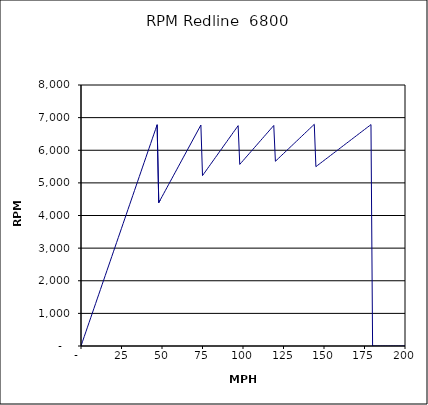
| Category | RPM Redline  6800 |
|---|---|
| 0.0 | 0 |
| 1.0 | 144.311 |
| 2.0 | 288.622 |
| 3.0 | 432.933 |
| 4.0 | 577.244 |
| 5.0 | 721.555 |
| 6.0 | 865.865 |
| 7.0 | 1010.176 |
| 8.0 | 1154.487 |
| 9.0 | 1298.798 |
| 10.0 | 1443.109 |
| 11.0 | 1587.42 |
| 12.0 | 1731.731 |
| 13.0 | 1876.042 |
| 14.0 | 2020.353 |
| 15.0 | 2164.664 |
| 16.0 | 2308.974 |
| 17.0 | 2453.285 |
| 18.0 | 2597.596 |
| 19.0 | 2741.907 |
| 20.0 | 2886.218 |
| 21.0 | 3030.529 |
| 22.0 | 3174.84 |
| 23.0 | 3319.151 |
| 24.0 | 3463.462 |
| 25.0 | 3607.773 |
| 26.0 | 3752.084 |
| 27.0 | 3896.394 |
| 28.0 | 4040.705 |
| 29.0 | 4185.016 |
| 30.0 | 4329.327 |
| 31.0 | 4473.638 |
| 32.0 | 4617.949 |
| 33.0 | 4762.26 |
| 34.0 | 4906.571 |
| 35.0 | 5050.882 |
| 36.0 | 5195.193 |
| 37.0 | 5339.503 |
| 38.0 | 5483.814 |
| 39.0 | 5628.125 |
| 40.0 | 5772.436 |
| 41.0 | 5916.747 |
| 42.0 | 6061.058 |
| 43.0 | 6205.369 |
| 44.0 | 6349.68 |
| 45.0 | 6493.991 |
| 46.0 | 6638.302 |
| 47.0 | 6782.613 |
| 48.0 | 4392.683 |
| 49.0 | 4484.197 |
| 50.0 | 4575.712 |
| 51.0 | 4667.226 |
| 52.0 | 4758.74 |
| 53.0 | 4850.254 |
| 54.0 | 4941.769 |
| 55.0 | 5033.283 |
| 56.0 | 5124.797 |
| 57.0 | 5216.311 |
| 58.0 | 5307.825 |
| 59.0 | 5399.34 |
| 60.0 | 5490.854 |
| 61.0 | 5582.368 |
| 62.0 | 5673.882 |
| 63.0 | 5765.397 |
| 64.0 | 5856.911 |
| 65.0 | 5948.425 |
| 66.0 | 6039.939 |
| 67.0 | 6131.454 |
| 68.0 | 6222.968 |
| 69.0 | 6314.482 |
| 70.0 | 6405.996 |
| 71.0 | 6497.511 |
| 72.0 | 6589.025 |
| 73.0 | 6680.539 |
| 74.0 | 6772.053 |
| 75.0 | 5222.28 |
| 76.0 | 5291.91 |
| 77.0 | 5361.54 |
| 78.0 | 5431.171 |
| 79.0 | 5500.801 |
| 80.0 | 5570.432 |
| 81.0 | 5640.062 |
| 82.0 | 5709.692 |
| 83.0 | 5779.323 |
| 84.0 | 5848.953 |
| 85.0 | 5918.584 |
| 86.0 | 5988.214 |
| 87.0 | 6057.844 |
| 88.0 | 6127.475 |
| 89.0 | 6197.105 |
| 90.0 | 6266.735 |
| 91.0 | 6336.366 |
| 92.0 | 6405.996 |
| 93.0 | 6475.627 |
| 94.0 | 6545.257 |
| 95.0 | 6614.887 |
| 96.0 | 6684.518 |
| 97.0 | 6754.148 |
| 98.0 | 5566.59 |
| 99.0 | 5623.392 |
| 100.0 | 5680.194 |
| 101.0 | 5736.996 |
| 102.0 | 5793.798 |
| 103.0 | 5850.6 |
| 104.0 | 5907.401 |
| 105.0 | 5964.203 |
| 106.0 | 6021.005 |
| 107.0 | 6077.807 |
| 108.0 | 6134.609 |
| 109.0 | 6191.411 |
| 110.0 | 6248.213 |
| 111.0 | 6305.015 |
| 112.0 | 6361.817 |
| 113.0 | 6418.619 |
| 114.0 | 6475.421 |
| 115.0 | 6532.223 |
| 116.0 | 6589.025 |
| 117.0 | 6645.827 |
| 118.0 | 6702.629 |
| 119.0 | 6759.431 |
| 120.0 | 5662.443 |
| 121.0 | 5709.63 |
| 122.0 | 5756.817 |
| 123.0 | 5804.004 |
| 124.0 | 5851.191 |
| 125.0 | 5898.378 |
| 126.0 | 5945.565 |
| 127.0 | 5992.752 |
| 128.0 | 6039.939 |
| 129.0 | 6087.126 |
| 130.0 | 6134.313 |
| 131.0 | 6181.5 |
| 132.0 | 6228.687 |
| 133.0 | 6275.874 |
| 134.0 | 6323.062 |
| 135.0 | 6370.249 |
| 136.0 | 6417.436 |
| 137.0 | 6464.623 |
| 138.0 | 6511.81 |
| 139.0 | 6558.997 |
| 140.0 | 6606.184 |
| 141.0 | 6653.371 |
| 142.0 | 6700.558 |
| 143.0 | 6747.745 |
| 144.0 | 6794.932 |
| 145.0 | 5497.391 |
| 146.0 | 5535.304 |
| 147.0 | 5573.217 |
| 148.0 | 5611.13 |
| 149.0 | 5649.043 |
| 150.0 | 5686.956 |
| 151.0 | 5724.869 |
| 152.0 | 5762.782 |
| 153.0 | 5800.695 |
| 154.0 | 5838.608 |
| 155.0 | 5876.521 |
| 156.0 | 5914.434 |
| 157.0 | 5952.347 |
| 158.0 | 5990.26 |
| 159.0 | 6028.173 |
| 160.0 | 6066.086 |
| 161.0 | 6103.999 |
| 162.0 | 6141.912 |
| 163.0 | 6179.825 |
| 164.0 | 6217.738 |
| 165.0 | 6255.651 |
| 166.0 | 6293.565 |
| 167.0 | 6331.478 |
| 168.0 | 6369.391 |
| 169.0 | 6407.304 |
| 170.0 | 6445.217 |
| 171.0 | 6483.13 |
| 172.0 | 6521.043 |
| 173.0 | 6558.956 |
| 174.0 | 6596.869 |
| 175.0 | 6634.782 |
| 176.0 | 6672.695 |
| 177.0 | 6710.608 |
| 178.0 | 6748.521 |
| 179.0 | 6786.434 |
| 180.0 | 0 |
| 181.0 | 0 |
| 182.0 | 0 |
| 183.0 | 0 |
| 184.0 | 0 |
| 185.0 | 0 |
| 186.0 | 0 |
| 187.0 | 0 |
| 188.0 | 0 |
| 189.0 | 0 |
| 190.0 | 0 |
| 191.0 | 0 |
| 192.0 | 0 |
| 193.0 | 0 |
| 194.0 | 0 |
| 195.0 | 0 |
| 196.0 | 0 |
| 197.0 | 0 |
| 198.0 | 0 |
| 199.0 | 0 |
| 200.0 | 0 |